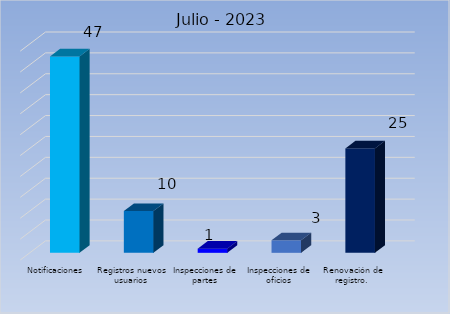
| Category | Cantidad |
|---|---|
| Notificaciones | 47 |
| Registros nuevos usuarios | 10 |
| Inspecciones de partes | 1 |
| Inspecciones de oficios | 3 |
| Renovación de registro.  | 25 |